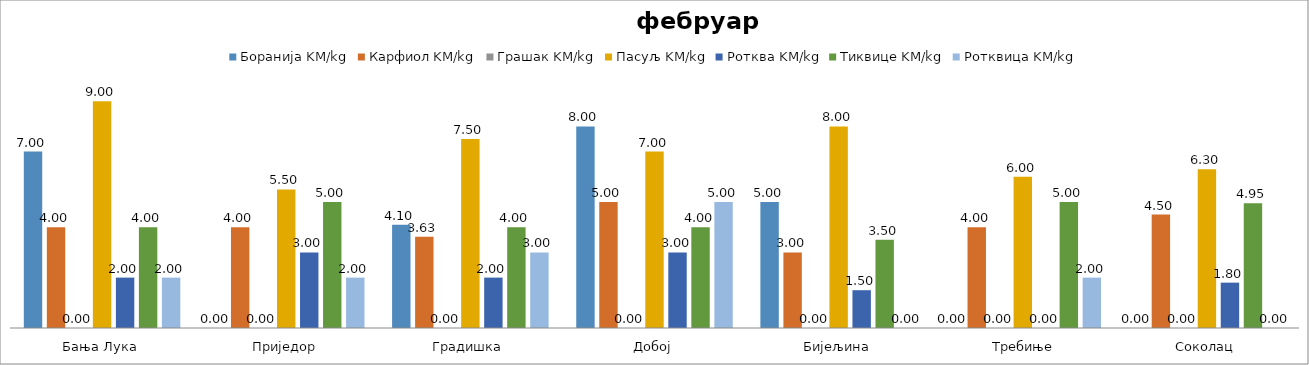
| Category | Боранија | Карфиол | Грашак | Пасуљ | Ротква | Тиквице | Ротквица |
|---|---|---|---|---|---|---|---|
| Бања Лука | 7 | 4 | 0 | 9 | 2 | 4 | 2 |
| Приједор | 0 | 4 | 0 | 5.5 | 3 | 5 | 2 |
| Градишка | 4.1 | 3.625 | 0 | 7.5 | 2 | 4 | 3 |
| Добој | 8 | 5 | 0 | 7 | 3 | 4 | 5 |
| Бијељина | 5 | 3 | 0 | 8 | 1.5 | 3.5 | 0 |
|  Требиње | 0 | 4 | 0 | 6 | 0 | 5 | 2 |
| Соколац | 0 | 4.5 | 0 | 6.3 | 1.8 | 4.95 | 0 |